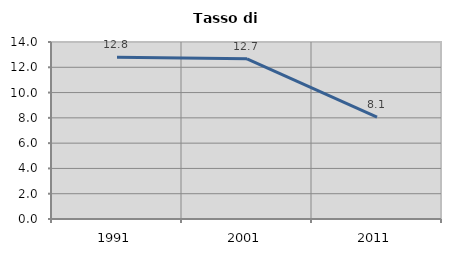
| Category | Tasso di disoccupazione   |
|---|---|
| 1991.0 | 12.793 |
| 2001.0 | 12.674 |
| 2011.0 | 8.053 |